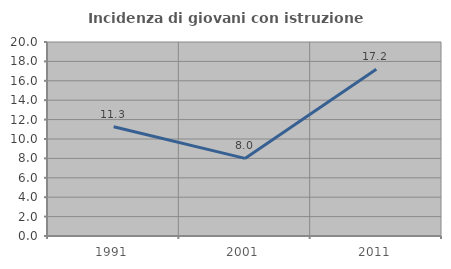
| Category | Incidenza di giovani con istruzione universitaria |
|---|---|
| 1991.0 | 11.268 |
| 2001.0 | 8 |
| 2011.0 | 17.188 |